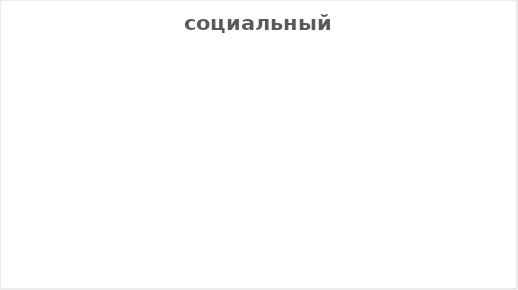
| Category | Series 0 |
|---|---|
| Упрямство | 0 |
| Настойчивость | 0 |
| Безволие | 0 |